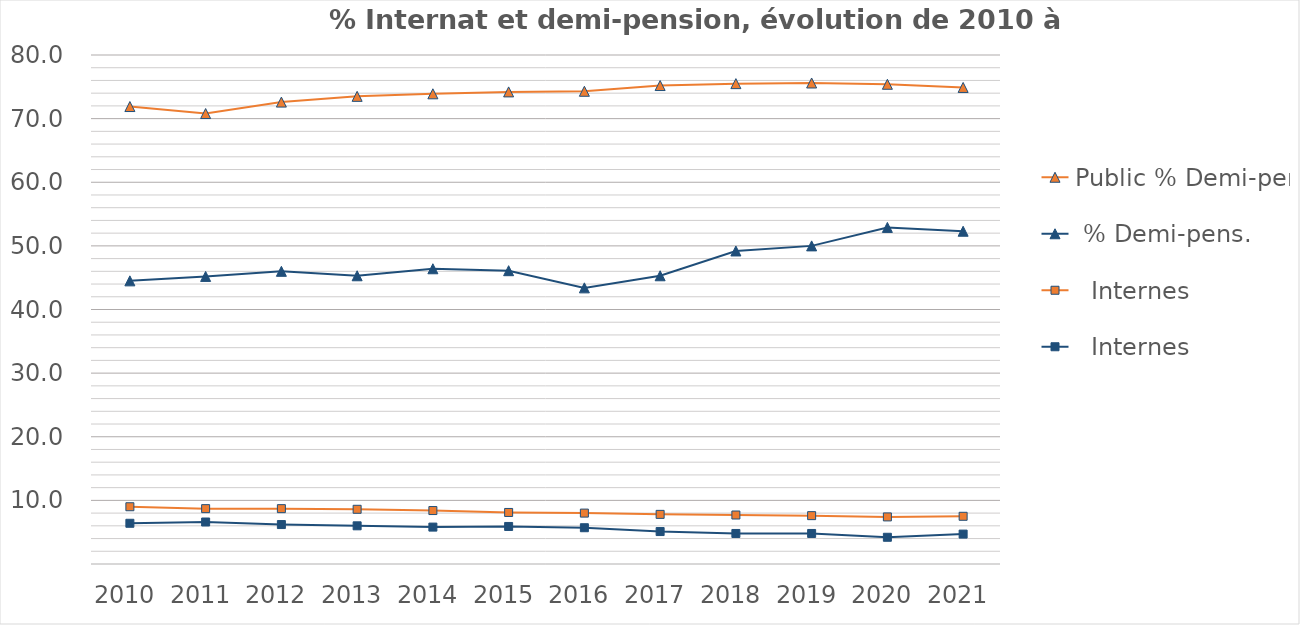
| Category | Public % Demi-pens. | Privé | Public |
|---|---|---|---|
| 2010 | 71.9 | 6.4 | 9 |
| 2011 | 70.8 | 6.6 | 8.7 |
| 2012 | 72.6 | 6.2 | 8.7 |
| 2013 | 73.5 | 6 | 8.6 |
| 2014 | 73.9 | 5.8 | 8.4 |
| 2015 | 74.2 | 5.9 | 8.1 |
| 2016 | 74.3 | 5.7 | 8 |
| 2017 | 75.2 | 5.1 | 7.8 |
| 2018 | 75.5 | 4.8 | 7.7 |
| 2019 | 75.6 | 4.8 | 7.6 |
| 2020 | 75.4 | 4.2 | 7.4 |
| 2021 | 74.9 | 4.7 | 7.5 |